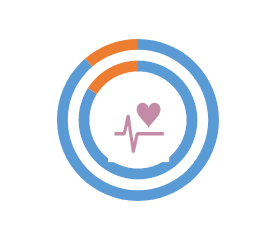
| Category | RS | Series 1 | EU |
|---|---|---|---|
| 0 | 84 |  | 88.7 |
| 1 | 16 |  | 11.3 |